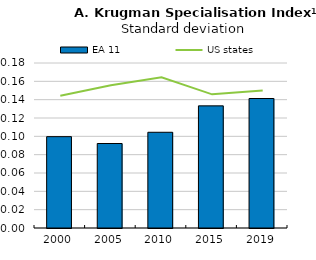
| Category | EA 11 |
|---|---|
| 2000.0 | 0.1 |
| 2005.0 | 0.092 |
| 2010.0 | 0.104 |
| 2015.0 | 0.133 |
| 2019.0 | 0.141 |